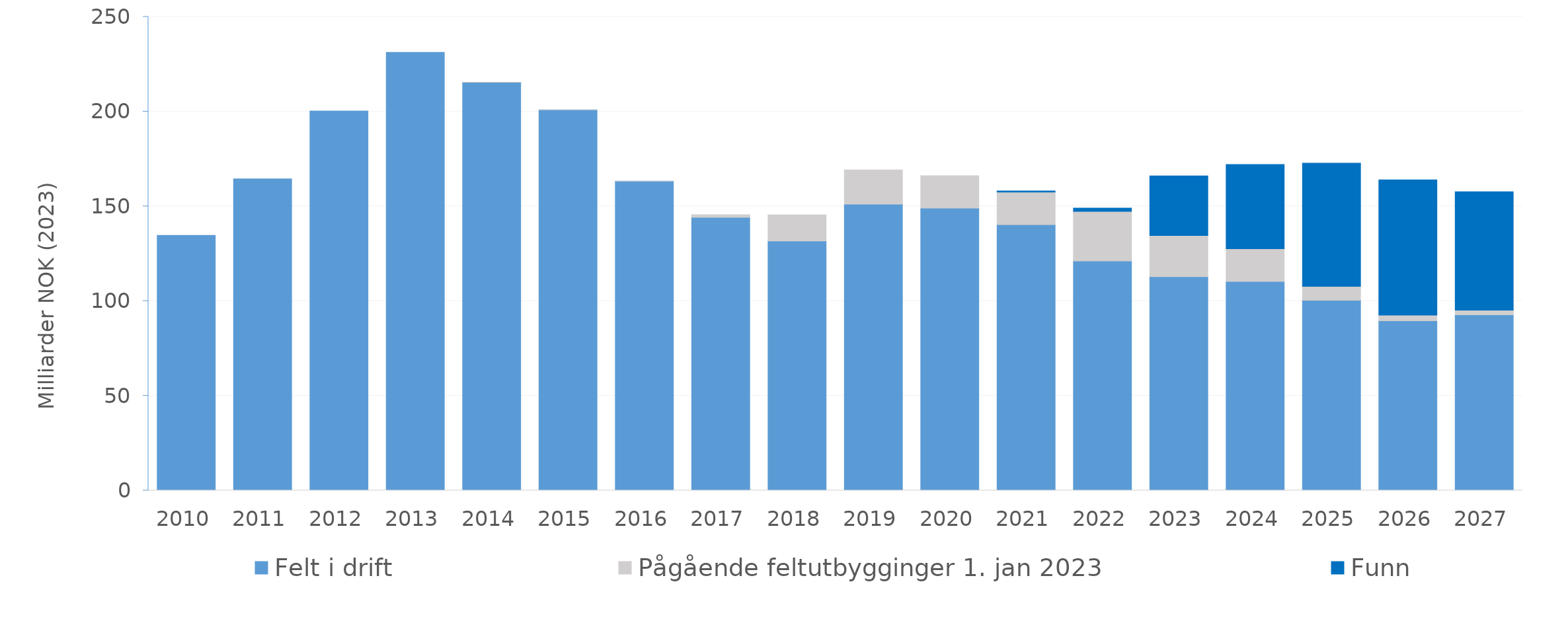
| Category | Felt i drift | Pågående feltutbygginger 1. jan 2023 | Funn |
|---|---|---|---|
| 2010.0 | 134.689 | 0 | 0 |
| 2011.0 | 164.493 | 0 | 0 |
| 2012.0 | 200.357 | 0 | 0 |
| 2013.0 | 231.288 | 0 | 0 |
| 2014.0 | 215.519 | 0.001 | 0 |
| 2015.0 | 200.931 | 0.004 | 0 |
| 2016.0 | 163.244 | 0.006 | 0 |
| 2017.0 | 144.141 | 1.41 | 0 |
| 2018.0 | 131.713 | 13.757 | 0 |
| 2019.0 | 151.113 | 18.08 | 0 |
| 2020.0 | 149.028 | 17.148 | 0 |
| 2021.0 | 140.3 | 17.234 | 0.593 |
| 2022.0 | 121.164 | 26.176 | 1.751 |
| 2023.0 | 112.894 | 21.703 | 31.436 |
| 2024.0 | 110.326 | 17.331 | 44.436 |
| 2025.0 | 100.452 | 7.271 | 65.003 |
| 2026.0 | 89.596 | 2.955 | 71.444 |
| 2027.0 | 92.709 | 2.476 | 62.539 |